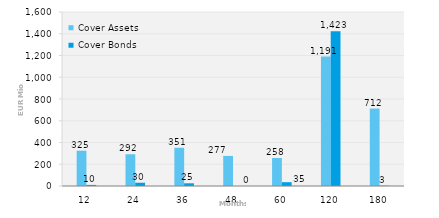
| Category | Cover Assets | Cover Bonds |
|---|---|---|
| 12.0 | 324.557 | 10 |
| 24.0 | 291.805 | 30 |
| 36.0 | 351.352 | 25 |
| 48.0 | 276.594 | 0 |
| 60.0 | 257.694 | 35 |
| 120.0 | 1190.683 | 1423.22 |
| 180.0 | 712.09 | 3 |